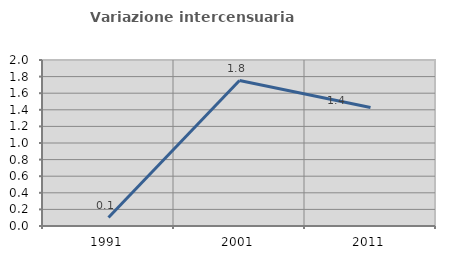
| Category | Variazione intercensuaria annua |
|---|---|
| 1991.0 | 0.102 |
| 2001.0 | 1.752 |
| 2011.0 | 1.427 |